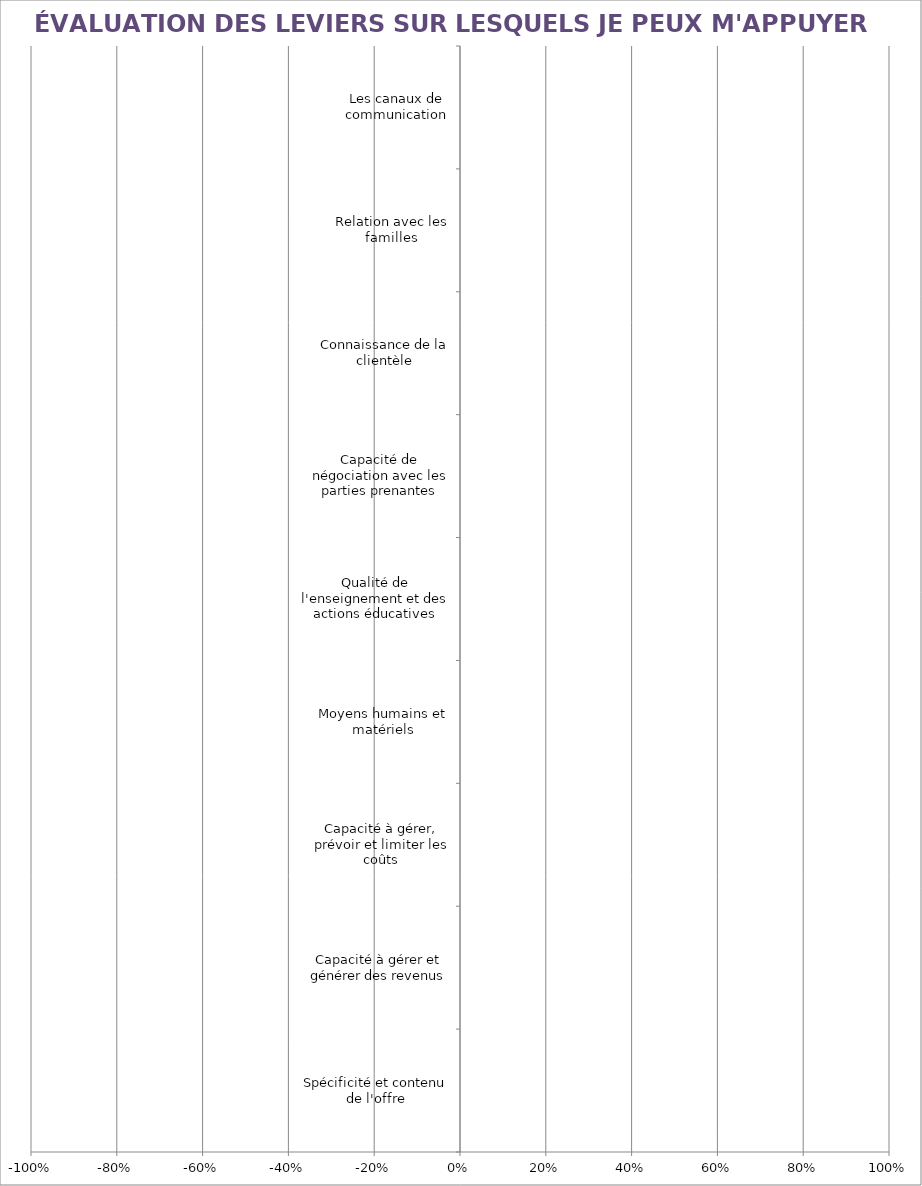
| Category | Series 0 |
|---|---|
| Spécificité et contenu de l'offre | 0 |
| Capacité à gérer et générer des revenus | 0 |
| Capacité à gérer, prévoir et limiter les coûts | 0 |
| Moyens humains et matériels | 0 |
| Qualité de l'enseignement et des actions éducatives | 0 |
| Capacité de négociation avec les parties prenantes | 0 |
| Connaissance de la clientèle | 0 |
| Relation avec les familles | 0 |
| Les canaux de communication | 0 |